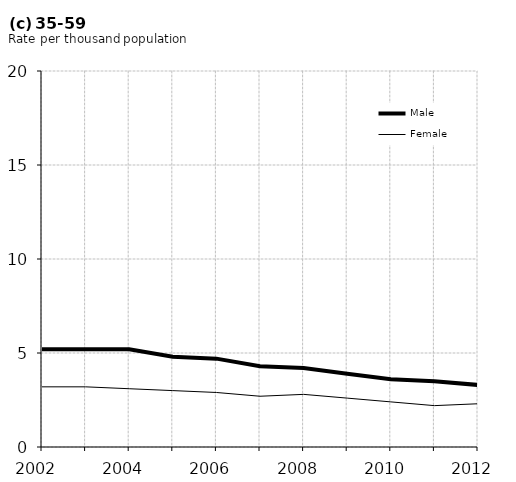
| Category | Male | Female |
|---|---|---|
| 2002.0 | 5.2 | 3.2 |
| 2003.0 | 5.2 | 3.2 |
| 2004.0 | 5.2 | 3.1 |
| 2005.0 | 4.8 | 3 |
| 2006.0 | 4.7 | 2.9 |
| 2007.0 | 4.3 | 2.7 |
| 2008.0 | 4.2 | 2.8 |
| 2009.0 | 3.9 | 2.6 |
| 2010.0 | 3.6 | 2.4 |
| 2011.0 | 3.5 | 2.2 |
| 2012.0 | 3.3 | 2.3 |